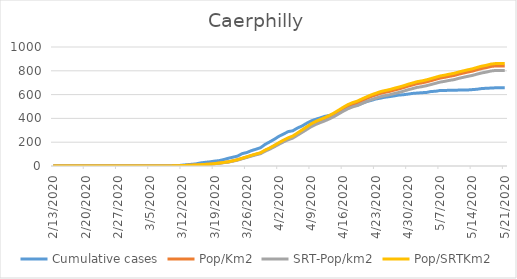
| Category | Cumulative cases | Pop/Km2 | SRT-Pop/km2 | Pop/SRTKm2 |
|---|---|---|---|---|
| 5/21/20 | 657 | 841.142 | 802.871 | 861.19 |
| 5/20/20 | 657 | 841.142 | 802.871 | 861.19 |
| 5/19/20 | 657 | 840.945 | 802.682 | 860.987 |
| 5/18/20 | 655 | 836.334 | 798.281 | 856.267 |
| 5/17/20 | 653 | 826.521 | 788.914 | 846.22 |
| 5/16/20 | 651 | 819.21 | 781.936 | 838.734 |
| 5/15/20 | 645 | 808.935 | 772.129 | 828.215 |
| 5/14/20 | 642 | 797.541 | 761.253 | 816.549 |
| 5/13/20 | 639 | 789.637 | 753.709 | 808.457 |
| 5/12/20 | 639 | 780.548 | 745.033 | 799.151 |
| 5/11/20 | 638 | 771.525 | 736.421 | 789.913 |
| 5/10/20 | 636 | 760.328 | 725.733 | 778.449 |
| 5/9/20 | 636 | 753.808 | 719.509 | 771.773 |
| 5/8/20 | 635 | 745.64 | 711.714 | 763.412 |
| 5/7/20 | 635 | 739.054 | 705.427 | 756.668 |
| 5/6/20 | 628 | 728.187 | 695.054 | 745.542 |
| 5/5/20 | 626 | 717.319 | 684.681 | 734.415 |
| 5/4/20 | 618 | 706.847 | 674.685 | 723.693 |
| 5/3/20 | 616 | 698.416 | 666.639 | 715.062 |
| 5/2/20 | 613 | 692.225 | 660.729 | 708.723 |
| 5/1/20 | 610 | 681.226 | 650.23 | 697.462 |
| 4/30/20 | 604 | 670.82 | 640.297 | 686.807 |
| 4/29/20 | 599 | 658.174 | 628.227 | 673.86 |
| 4/28/20 | 596 | 647.438 | 617.98 | 662.869 |
| 4/27/20 | 589 | 637.822 | 608.801 | 653.023 |
| 4/26/20 | 583 | 627.02 | 598.491 | 641.964 |
| 4/25/20 | 578 | 619.183 | 591.01 | 633.94 |
| 4/24/20 | 570 | 610.291 | 582.523 | 624.836 |
| 4/23/20 | 563 | 596.657 | 569.509 | 610.878 |
| 4/22/20 | 551 | 583.616 | 557.062 | 597.526 |
| 4/21/20 | 541 | 567.085 | 541.282 | 580.6 |
| 4/20/20 | 526 | 550.421 | 525.377 | 563.539 |
| 4/19/20 | 509 | 532.309 | 508.089 | 544.995 |
| 4/18/20 | 508 | 520.585 | 496.898 | 532.992 |
| 4/17/20 | 485 | 504.58 | 481.622 | 516.606 |
| 4/16/20 | 473 | 483.372 | 461.379 | 494.892 |
| 4/15/20 | 449 | 459.727 | 438.81 | 470.684 |
| 4/14/20 | 437 | 436.346 | 416.492 | 446.745 |
| 4/13/20 | 425 | 415.928 | 397.003 | 425.841 |
| 4/12/20 | 418 | 398.342 | 380.218 | 407.836 |
| 4/11/20 | 405 | 382.337 | 364.941 | 391.45 |
| 4/10/20 | 393 | 366.267 | 349.602 | 374.996 |
| 4/9/20 | 379 | 346.508 | 330.742 | 354.766 |
| 4/8/20 | 359 | 320.821 | 306.224 | 328.467 |
| 4/7/20 | 336 | 295.595 | 282.146 | 302.64 |
| 4/6/20 | 319 | 270.831 | 258.508 | 277.285 |
| 4/5/20 | 296 | 245.868 | 234.681 | 251.728 |
| 4/4/20 | 289 | 231.313 | 220.788 | 236.825 |
| 4/3/20 | 269 | 212.805 | 203.122 | 217.877 |
| 4/2/20 | 250 | 191.465 | 182.754 | 196.028 |
| 4/1/20 | 225 | 169.533 | 161.819 | 173.573 |
| 3/31/20 | 203 | 148.456 | 141.702 | 151.994 |
| 3/30/20 | 182 | 130.607 | 124.665 | 133.72 |
| 3/29/20 | 154 | 108.609 | 103.667 | 111.197 |
| 3/28/20 | 141 | 98.334 | 93.86 | 100.678 |
| 3/27/20 | 129 | 87.401 | 83.424 | 89.484 |
| 3/26/20 | 113 | 75.216 | 71.794 | 77.009 |
| 3/25/20 | 104 | 63.756 | 60.855 | 65.275 |
| 3/24/20 | 83 | 51.703 | 49.35 | 52.935 |
| 3/23/20 | 74 | 42.811 | 40.863 | 43.832 |
| 3/22/20 | 65 | 34.249 | 32.691 | 35.065 |
| 3/21/20 | 54 | 29.243 | 27.913 | 29.94 |
| 3/20/20 | 45 | 24.304 | 23.198 | 24.883 |
| 3/19/20 | 41 | 19.561 | 18.671 | 20.028 |
| 3/18/20 | 35 | 15.61 | 14.899 | 15.982 |
| 3/17/20 | 31 | 13.304 | 12.699 | 13.622 |
| 3/16/20 | 26 | 10.867 | 10.373 | 11.126 |
| 3/15/20 | 18 | 8.628 | 8.236 | 8.834 |
| 3/14/20 | 14 | 6.718 | 6.412 | 6.878 |
| 3/13/20 | 11 | 5.467 | 5.218 | 5.597 |
| 3/12/20 | 7 | 3.688 | 3.521 | 3.776 |
| 3/11/20 | 3 | 2.108 | 2.012 | 2.158 |
| 3/10/20 | 1 | 1.186 | 1.132 | 1.214 |
| 3/9/20 | 0 | 0.461 | 0.44 | 0.472 |
| 3/8/20 | 0 | 0.263 | 0.251 | 0.27 |
| 3/7/20 | 0 | 0.263 | 0.251 | 0.27 |
| 3/6/20 | 0 | 0.132 | 0.126 | 0.135 |
| 3/5/20 | 0 | 0.132 | 0.126 | 0.135 |
| 3/4/20 | 0 | 0.132 | 0.126 | 0.135 |
| 3/3/20 | 0 | 0.066 | 0.063 | 0.067 |
| 3/2/20 | 0 | 0.066 | 0.063 | 0.067 |
| 3/1/20 | 0 | 0.066 | 0.063 | 0.067 |
| 2/29/20 | 0 | 0.066 | 0.063 | 0.067 |
| 2/28/20 | 0 | 0.066 | 0.063 | 0.067 |
| 2/27/20 | 0 | 0.066 | 0.063 | 0.067 |
| 2/26/20 | 0 | 0 | 0 | 0 |
| 2/25/20 | 0 | 0 | 0 | 0 |
| 2/24/20 | 0 | 0 | 0 | 0 |
| 2/23/20 | 0 | 0 | 0 | 0 |
| 2/22/20 | 0 | 0 | 0 | 0 |
| 2/21/20 | 0 | 0 | 0 | 0 |
| 2/20/20 | 0 | 0 | 0 | 0 |
| 2/19/20 | 0 | 0 | 0 | 0 |
| 2/18/20 | 0 | 0 | 0 | 0 |
| 2/17/20 | 0 | 0 | 0 | 0 |
| 2/16/20 | 0 | 0 | 0 | 0 |
| 2/15/20 | 0 | 0 | 0 | 0 |
| 2/14/20 | 0 | 0 | 0 | 0 |
| 2/13/20 | 0 | 0 | 0 | 0 |